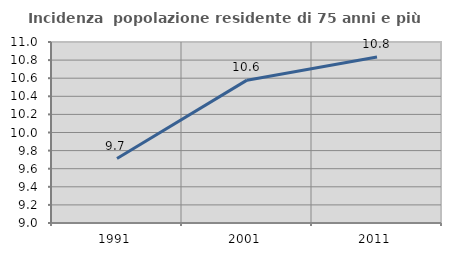
| Category | Incidenza  popolazione residente di 75 anni e più |
|---|---|
| 1991.0 | 9.712 |
| 2001.0 | 10.578 |
| 2011.0 | 10.835 |